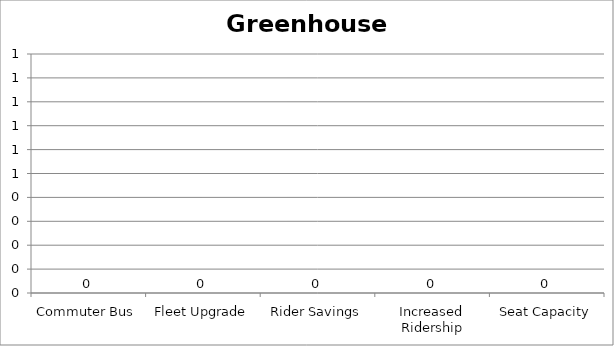
| Category | Greenhouse Gas |
|---|---|
| Commuter Bus | 0 |
| Fleet Upgrade | 0 |
| Rider Savings | 0 |
| Increased Ridership | 0 |
| Seat Capacity | 0 |